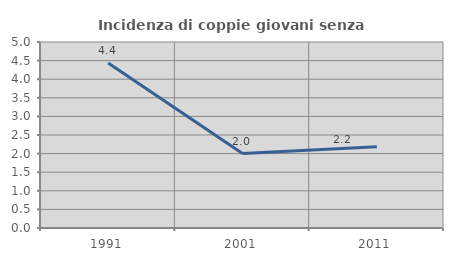
| Category | Incidenza di coppie giovani senza figli |
|---|---|
| 1991.0 | 4.433 |
| 2001.0 | 2 |
| 2011.0 | 2.186 |